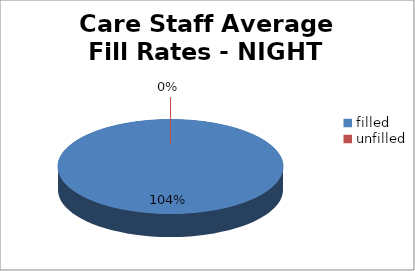
| Category | Series 0 |
|---|---|
| filled | 104 |
| unfilled | 0 |